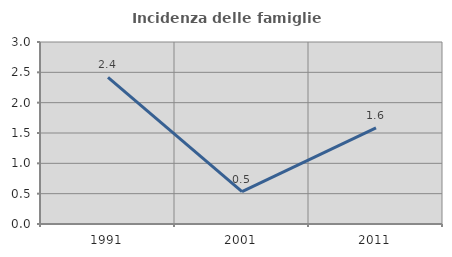
| Category | Incidenza delle famiglie numerose |
|---|---|
| 1991.0 | 2.417 |
| 2001.0 | 0.535 |
| 2011.0 | 1.584 |